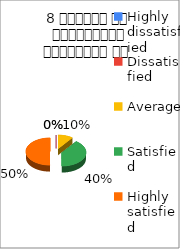
| Category | 8 शिक्षक का सम्प्रेषण सुस्पष्ठ है  |
|---|---|
| Highly dissatisfied | 0 |
| Dissatisfied | 0 |
| Average | 4 |
| Satisfied | 16 |
| Highly satisfied | 20 |